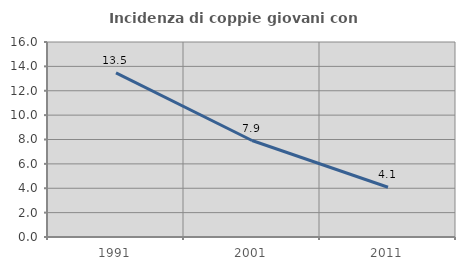
| Category | Incidenza di coppie giovani con figli |
|---|---|
| 1991.0 | 13.467 |
| 2001.0 | 7.918 |
| 2011.0 | 4.082 |